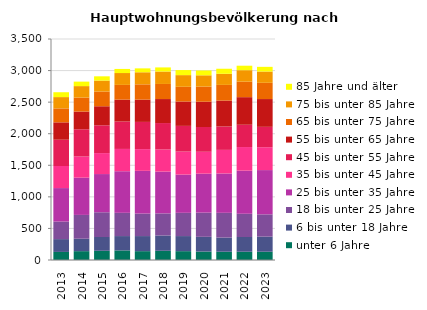
| Category | unter 6 Jahre | 6 bis unter 18 Jahre | 18 bis unter 25 Jahre | 25 bis unter 35 Jahre | 35 bis unter 45 Jahre | 45 bis unter 55 Jahre | 55 bis unter 65 Jahre | 65 bis unter 75 Jahre | 75 bis unter 85 Jahre | 85 Jahre und älter |
|---|---|---|---|---|---|---|---|---|---|---|
| 2013.0 | 128 | 203 | 278 | 530 | 350 | 416 | 275 | 221 | 179 | 77 |
| 2014.0 | 140 | 197 | 377 | 590 | 335 | 431 | 281 | 221 | 182 | 71 |
| 2015.0 | 146 | 218 | 392 | 605 | 332 | 440 | 302 | 233 | 173 | 68 |
| 2016.0 | 152 | 227 | 368 | 659 | 353 | 434 | 347 | 233 | 188 | 65 |
| 2017.0 | 140 | 239 | 356 | 677 | 344 | 431 | 353 | 242 | 191 | 62 |
| 2018.0 | 146 | 242 | 350 | 662 | 350 | 419 | 380 | 239 | 197 | 65 |
| 2019.0 | 140 | 239 | 368 | 605 | 365 | 407 | 386 | 233 | 185 | 80 |
| 2020.0 | 134 | 233 | 383 | 617 | 347 | 392 | 401 | 239 | 179 | 77 |
| 2021.0 | 131 | 224 | 392 | 623 | 374 | 371 | 410 | 248 | 176 | 80 |
| 2022.0 | 131 | 233 | 368 | 683 | 374 | 353 | 437 | 245 | 182 | 71 |
| 2023.0 | 131 | 239 | 353 | 701 | 362 | 323 | 440 | 257 | 179 | 74 |